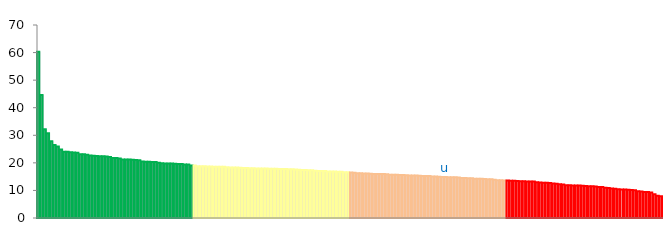
| Category | Top Quartile | 2nd Quartile | 3rd Quartile | Bottom Quartile | Series 4 |
|---|---|---|---|---|---|
|  | 60.341 | 0 | 0 | 0 | 60.341 |
|  | 44.656 | 0 | 0 | 0 | 44.656 |
|  | 32.225 | 0 | 0 | 0 | 32.225 |
|  | 30.757 | 0 | 0 | 0 | 30.757 |
|  | 27.795 | 0 | 0 | 0 | 27.795 |
|  | 26.498 | 0 | 0 | 0 | 26.498 |
|  | 25.916 | 0 | 0 | 0 | 25.916 |
|  | 24.834 | 0 | 0 | 0 | 24.834 |
|  | 24.044 | 0 | 0 | 0 | 24.044 |
|  | 23.985 | 0 | 0 | 0 | 23.985 |
|  | 23.82 | 0 | 0 | 0 | 23.82 |
|  | 23.762 | 0 | 0 | 0 | 23.762 |
|  | 23.631 | 0 | 0 | 0 | 23.631 |
|  | 23.141 | 0 | 0 | 0 | 23.141 |
|  | 23.116 | 0 | 0 | 0 | 23.116 |
|  | 22.92 | 0 | 0 | 0 | 22.92 |
|  | 22.688 | 0 | 0 | 0 | 22.688 |
|  | 22.607 | 0 | 0 | 0 | 22.607 |
|  | 22.532 | 0 | 0 | 0 | 22.532 |
|  | 22.438 | 0 | 0 | 0 | 22.438 |
|  | 22.377 | 0 | 0 | 0 | 22.377 |
|  | 22.316 | 0 | 0 | 0 | 22.316 |
|  | 22.135 | 0 | 0 | 0 | 22.135 |
|  | 21.804 | 0 | 0 | 0 | 21.804 |
|  | 21.724 | 0 | 0 | 0 | 21.724 |
|  | 21.592 | 0 | 0 | 0 | 21.592 |
|  | 21.257 | 0 | 0 | 0 | 21.257 |
|  | 21.2 | 0 | 0 | 0 | 21.2 |
|  | 21.191 | 0 | 0 | 0 | 21.191 |
|  | 21.13 | 0 | 0 | 0 | 21.13 |
|  | 21.043 | 0 | 0 | 0 | 21.043 |
|  | 20.939 | 0 | 0 | 0 | 20.939 |
|  | 20.451 | 0 | 0 | 0 | 20.451 |
|  | 20.427 | 0 | 0 | 0 | 20.427 |
|  | 20.416 | 0 | 0 | 0 | 20.416 |
|  | 20.285 | 0 | 0 | 0 | 20.285 |
|  | 20.269 | 0 | 0 | 0 | 20.269 |
|  | 20.002 | 0 | 0 | 0 | 20.002 |
|  | 19.821 | 0 | 0 | 0 | 19.821 |
|  | 19.798 | 0 | 0 | 0 | 19.798 |
|  | 19.775 | 0 | 0 | 0 | 19.775 |
|  | 19.731 | 0 | 0 | 0 | 19.731 |
|  | 19.664 | 0 | 0 | 0 | 19.664 |
|  | 19.615 | 0 | 0 | 0 | 19.615 |
|  | 19.599 | 0 | 0 | 0 | 19.599 |
|  | 19.381 | 0 | 0 | 0 | 19.381 |
|  | 19.372 | 0 | 0 | 0 | 19.372 |
|  | 19.056 | 0 | 0 | 0 | 19.056 |
|  | 0 | 19.035 | 0 | 0 | 19.035 |
|  | 0 | 18.773 | 0 | 0 | 18.773 |
|  | 0 | 18.772 | 0 | 0 | 18.772 |
|  | 0 | 18.769 | 0 | 0 | 18.769 |
|  | 0 | 18.687 | 0 | 0 | 18.687 |
|  | 0 | 18.665 | 0 | 0 | 18.665 |
|  | 0 | 18.611 | 0 | 0 | 18.611 |
|  | 0 | 18.61 | 0 | 0 | 18.61 |
|  | 0 | 18.578 | 0 | 0 | 18.578 |
|  | 0 | 18.572 | 0 | 0 | 18.572 |
|  | 0 | 18.392 | 0 | 0 | 18.392 |
|  | 0 | 18.344 | 0 | 0 | 18.344 |
|  | 0 | 18.306 | 0 | 0 | 18.306 |
|  | 0 | 18.301 | 0 | 0 | 18.301 |
|  | 0 | 18.204 | 0 | 0 | 18.204 |
|  | 0 | 18.139 | 0 | 0 | 18.139 |
|  | 0 | 18.124 | 0 | 0 | 18.124 |
|  | 0 | 18.084 | 0 | 0 | 18.084 |
|  | 0 | 18.014 | 0 | 0 | 18.014 |
|  | 0 | 17.991 | 0 | 0 | 17.991 |
|  | 0 | 17.991 | 0 | 0 | 17.991 |
|  | 0 | 17.946 | 0 | 0 | 17.946 |
|  | 0 | 17.944 | 0 | 0 | 17.944 |
|  | 0 | 17.894 | 0 | 0 | 17.894 |
|  | 0 | 17.865 | 0 | 0 | 17.865 |
|  | 0 | 17.852 | 0 | 0 | 17.852 |
|  | 0 | 17.776 | 0 | 0 | 17.776 |
|  | 0 | 17.752 | 0 | 0 | 17.752 |
|  | 0 | 17.729 | 0 | 0 | 17.729 |
|  | 0 | 17.69 | 0 | 0 | 17.69 |
|  | 0 | 17.654 | 0 | 0 | 17.654 |
|  | 0 | 17.636 | 0 | 0 | 17.636 |
|  | 0 | 17.456 | 0 | 0 | 17.456 |
|  | 0 | 17.419 | 0 | 0 | 17.419 |
|  | 0 | 17.368 | 0 | 0 | 17.368 |
|  | 0 | 17.357 | 0 | 0 | 17.357 |
|  | 0 | 17.316 | 0 | 0 | 17.316 |
|  | 0 | 17.118 | 0 | 0 | 17.118 |
|  | 0 | 17.022 | 0 | 0 | 17.022 |
|  | 0 | 17.013 | 0 | 0 | 17.013 |
|  | 0 | 17.008 | 0 | 0 | 17.008 |
|  | 0 | 16.876 | 0 | 0 | 16.876 |
|  | 0 | 16.871 | 0 | 0 | 16.871 |
|  | 0 | 16.824 | 0 | 0 | 16.824 |
|  | 0 | 16.779 | 0 | 0 | 16.779 |
|  | 0 | 16.767 | 0 | 0 | 16.767 |
|  | 0 | 16.622 | 0 | 0 | 16.622 |
|  | 0 | 16.574 | 0 | 0 | 16.574 |
|  | 0 | 0 | 16.546 | 0 | 16.546 |
|  | 0 | 0 | 16.445 | 0 | 16.445 |
|  | 0 | 0 | 16.268 | 0 | 16.268 |
|  | 0 | 0 | 16.246 | 0 | 16.246 |
|  | 0 | 0 | 16.172 | 0 | 16.172 |
|  | 0 | 0 | 16.145 | 0 | 16.145 |
|  | 0 | 0 | 16.035 | 0 | 16.035 |
|  | 0 | 0 | 15.96 | 0 | 15.96 |
|  | 0 | 0 | 15.958 | 0 | 15.958 |
|  | 0 | 0 | 15.945 | 0 | 15.945 |
|  | 0 | 0 | 15.923 | 0 | 15.923 |
|  | 0 | 0 | 15.891 | 0 | 15.891 |
|  | 0 | 0 | 15.72 | 0 | 15.72 |
|  | 0 | 0 | 15.693 | 0 | 15.693 |
|  | 0 | 0 | 15.669 | 0 | 15.669 |
|  | 0 | 0 | 15.602 | 0 | 15.602 |
|  | 0 | 0 | 15.593 | 0 | 15.593 |
|  | 0 | 0 | 15.541 | 0 | 15.541 |
|  | 0 | 0 | 15.436 | 0 | 15.436 |
|  | 0 | 0 | 15.411 | 0 | 15.411 |
|  | 0 | 0 | 15.404 | 0 | 15.404 |
|  | 0 | 0 | 15.289 | 0 | 15.289 |
|  | 0 | 0 | 15.239 | 0 | 15.239 |
|  | 0 | 0 | 15.229 | 0 | 15.229 |
|  | 0 | 0 | 15.197 | 0 | 15.197 |
|  | 0 | 0 | 15.065 | 0 | 15.065 |
|  | 0 | 0 | 15.016 | 0 | 15.016 |
|  | 0 | 0 | 14.932 | 0 | 14.932 |
|  | 0 | 0 | 14.904 | 0 | 14.904 |
| u | 0 | 0 | 14.884 | 0 | 14.884 |